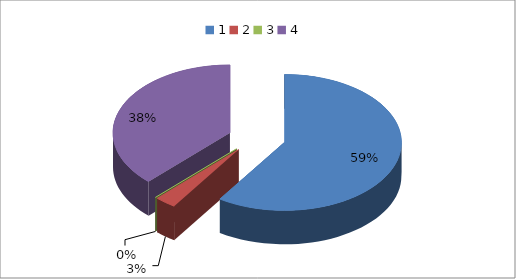
| Category | Series 0 |
|---|---|
| 0 | 9172319.24 |
| 1 | 453953.77 |
| 2 | 254.34 |
| 3 | 5841016.16 |